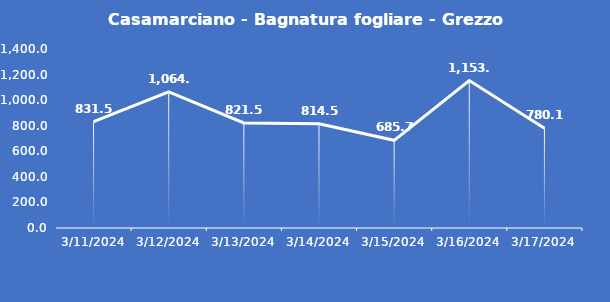
| Category | Casamarciano - Bagnatura fogliare - Grezzo (min) |
|---|---|
| 3/11/24 | 831.5 |
| 3/12/24 | 1064.6 |
| 3/13/24 | 821.5 |
| 3/14/24 | 814.5 |
| 3/15/24 | 685.7 |
| 3/16/24 | 1153 |
| 3/17/24 | 780.1 |